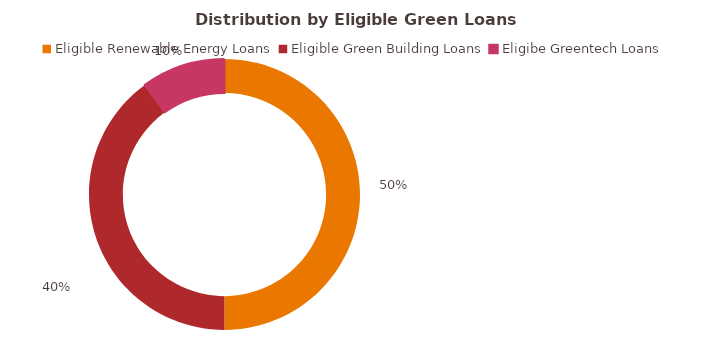
| Category | Series 0 |
|---|---|
| Eligible Renewable Energy Loans | 0.5 |
| Eligible Green Building Loans | 0.4 |
| Eligibe Greentech Loans | 0.1 |